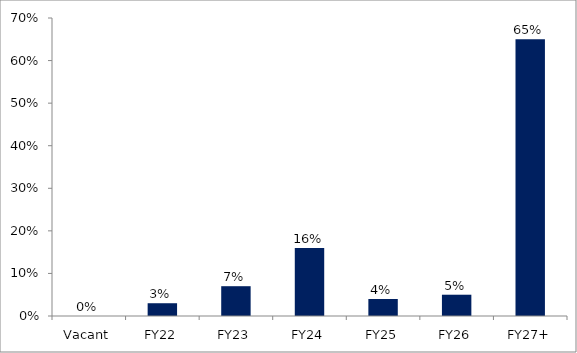
| Category | Series 0 |
|---|---|
| Vacant | 0 |
| FY22 | 0.03 |
| FY23 | 0.07 |
| FY24 | 0.16 |
| FY25 | 0.04 |
| FY26 | 0.05 |
| FY27+ | 0.65 |